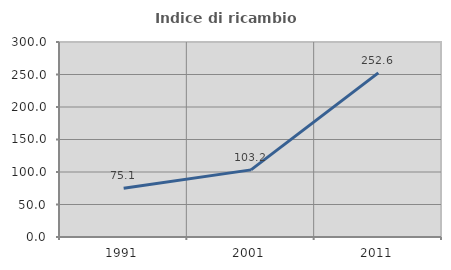
| Category | Indice di ricambio occupazionale  |
|---|---|
| 1991.0 | 75.139 |
| 2001.0 | 103.248 |
| 2011.0 | 252.574 |